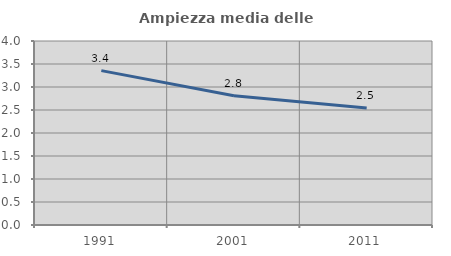
| Category | Ampiezza media delle famiglie |
|---|---|
| 1991.0 | 3.356 |
| 2001.0 | 2.811 |
| 2011.0 | 2.545 |